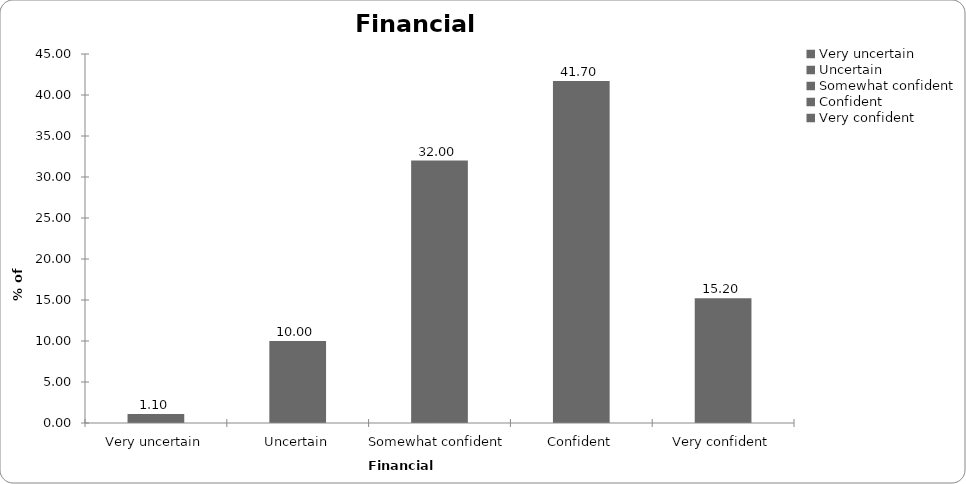
| Category | Financial confidence |
|---|---|
| Very uncertain | 1.1 |
| Uncertain | 10 |
| Somewhat confident | 32 |
| Confident | 41.7 |
| Very confident | 15.2 |